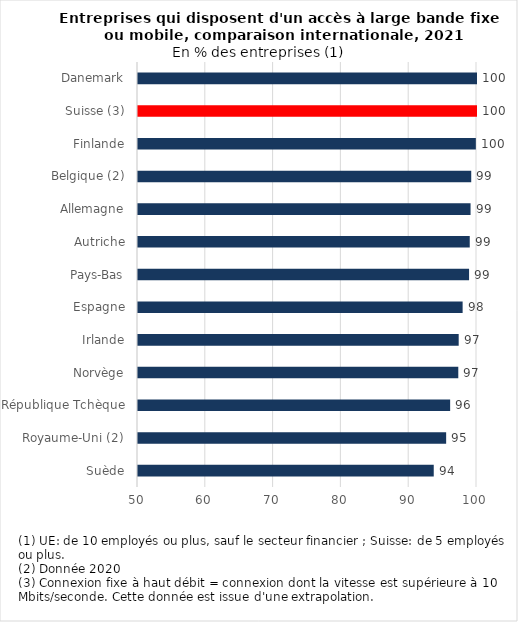
| Category | 2021 |
|---|---|
| Suède | 93.62 |
| Royaume-Uni (2) | 95.45 |
| République Tchèque | 96.04 |
| Norvège | 97.24 |
| Irlande | 97.3 |
| Espagne | 97.88 |
| Pays-Bas | 98.83 |
| Autriche | 98.93 |
| Allemagne | 99.05 |
| Belgique (2) | 99.15 |
| Finlande | 99.83 |
| Suisse (3) | 100 |
| Danemark | 100 |